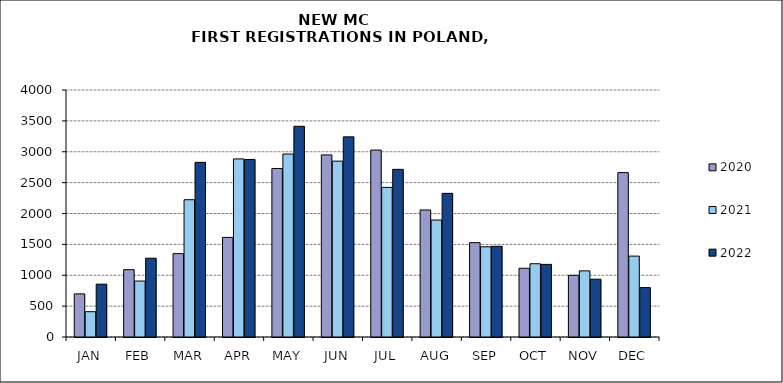
| Category | 2020 | 2021 | 2022 |
|---|---|---|---|
|  JAN  | 698 | 410 | 856 |
|  FEB  | 1090 | 906 | 1276 |
| MAR | 1350 | 2223 | 2828 |
| APR | 1613 | 2884 | 2875 |
| MAY | 2729 | 2963 | 3412 |
| JUN | 2949 | 2848 | 3241 |
| JUL | 3027 | 2423 | 2715 |
| AUG | 2057 | 1894 | 2326 |
| SEP | 1528 | 1461 | 1469 |
| OCT | 1113 | 1186 | 1176 |
| NOV | 999 | 1071 | 936 |
| DEC | 2662 | 1310 | 800 |